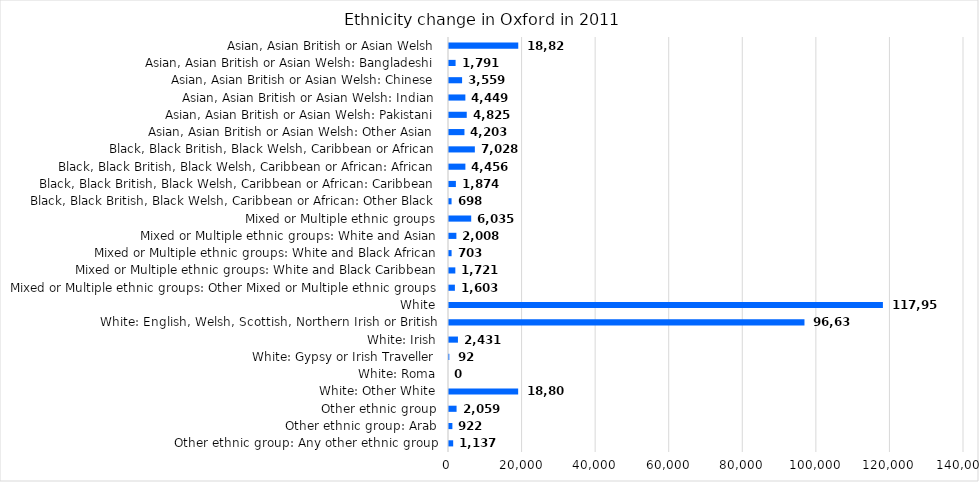
| Category | Series 0 |
|---|---|
| Asian, Asian British or Asian Welsh | 18827 |
| Asian, Asian British or Asian Welsh: Bangladeshi | 1791 |
| Asian, Asian British or Asian Welsh: Chinese | 3559 |
| Asian, Asian British or Asian Welsh: Indian | 4449 |
| Asian, Asian British or Asian Welsh: Pakistani | 4825 |
| Asian, Asian British or Asian Welsh: Other Asian | 4203 |
| Black, Black British, Black Welsh, Caribbean or African | 7028 |
| Black, Black British, Black Welsh, Caribbean or African: African | 4456 |
| Black, Black British, Black Welsh, Caribbean or African: Caribbean | 1874 |
| Black, Black British, Black Welsh, Caribbean or African: Other Black | 698 |
| Mixed or Multiple ethnic groups | 6035 |
| Mixed or Multiple ethnic groups: White and Asian | 2008 |
| Mixed or Multiple ethnic groups: White and Black African | 703 |
| Mixed or Multiple ethnic groups: White and Black Caribbean | 1721 |
| Mixed or Multiple ethnic groups: Other Mixed or Multiple ethnic groups | 1603 |
| White | 117957 |
| White: English, Welsh, Scottish, Northern Irish or British | 96633 |
| White: Irish | 2431 |
| White: Gypsy or Irish Traveller | 92 |
| White: Roma | 0 |
| White: Other White | 18801 |
| Other ethnic group | 2059 |
| Other ethnic group: Arab | 922 |
| Other ethnic group: Any other ethnic group | 1137 |